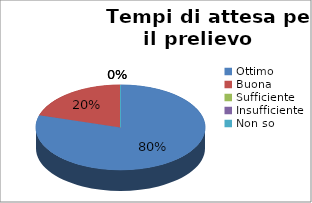
| Category | Tempi di attesa per il prelievo |
|---|---|
| Ottimo | 39 |
| Buona | 10 |
| Sufficiente | 0 |
| Insufficiente | 0 |
| Non so | 0 |